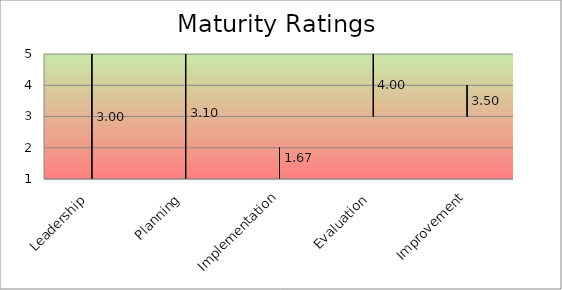
| Category | Min | Max | Average |
|---|---|---|---|
| Leadership | 1 | 5 | 3 |
| Planning | 1 | 5 | 3.1 |
| Implementation | 1 | 2 | 1.667 |
| Evaluation | 3 | 5 | 4 |
| Improvement | 3 | 4 | 3.5 |